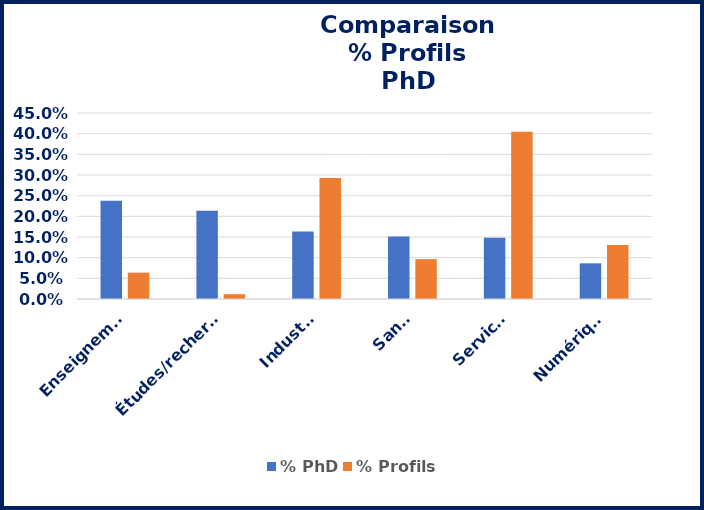
| Category | % PhD | % Profils |
|---|---|---|
| Enseignement | 0.238 | 0.064 |
| Études/recherche | 0.213 | 0.012 |
| Industrie | 0.163 | 0.293 |
| Santé | 0.151 | 0.096 |
| Services | 0.148 | 0.405 |
| Numérique | 0.086 | 0.131 |